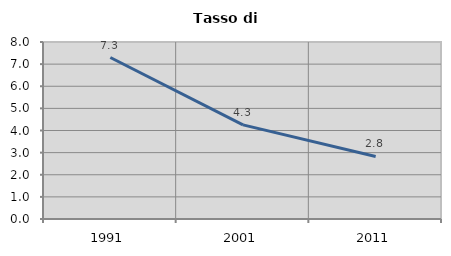
| Category | Tasso di disoccupazione   |
|---|---|
| 1991.0 | 7.299 |
| 2001.0 | 4.255 |
| 2011.0 | 2.826 |